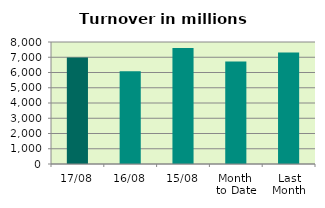
| Category | Series 0 |
|---|---|
| 17/08 | 6988.146 |
| 16/08 | 6088.86 |
| 15/08 | 7613.323 |
| Month 
to Date | 6714.013 |
| Last
Month | 7313.522 |